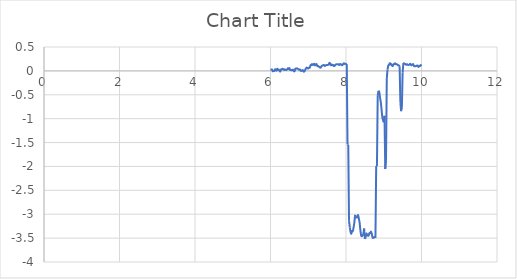
| Category | Series 0 |
|---|---|
| 6.0 | 0.021 |
| 6.02 | 0.028 |
| 6.04 | 0.028 |
| 6.06 | -0.007 |
| 6.08 | -0.001 |
| 6.1 | -0.001 |
| 6.12 | 0.032 |
| 6.14 | 0.028 |
| 6.16 | 0.005 |
| 6.18 | 0.044 |
| 6.2 | 0.021 |
| 6.22 | 0.028 |
| 6.24 | 0.001 |
| 6.26 | -0.013 |
| 6.28 | 0.031 |
| 6.3 | 0.031 |
| 6.32 | 0.044 |
| 6.34 | 0.036 |
| 6.36 | 0.018 |
| 6.38 | 0.032 |
| 6.4 | 0.021 |
| 6.42 | 0.021 |
| 6.44 | 0.03 |
| 6.46 | 0.055 |
| 6.48 | 0.038 |
| 6.5 | 0.059 |
| 6.52 | 0.02 |
| 6.54 | 0.02 |
| 6.56 | 0.011 |
| 6.58 | 0.02 |
| 6.6 | 0.024 |
| 6.62 | -0.008 |
| 6.64 | -0.004 |
| 6.66 | 0.045 |
| 6.68 | 0.045 |
| 6.7 | 0.053 |
| 6.72 | 0.045 |
| 6.74 | 0.035 |
| 6.76 | 0.025 |
| 6.78 | 0.028 |
| 6.8 | 0.004 |
| 6.82 | -0.001 |
| 6.84 | 0.014 |
| 6.86 | 0.014 |
| 6.88 | -0.015 |
| 6.9 | -0.008 |
| 6.92 | 0.023 |
| 6.94 | 0.053 |
| 6.96 | 0.069 |
| 6.98 | 0.06 |
| 7.0 | 0.049 |
| 7.02 | 0.066 |
| 7.04 | 0.066 |
| 7.06 | 0.12 |
| 7.08 | 0.12 |
| 7.1 | 0.143 |
| 7.12 | 0.124 |
| 7.14 | 0.13 |
| 7.16 | 0.149 |
| 7.18 | 0.115 |
| 7.2 | 0.136 |
| 7.22 | 0.141 |
| 7.24 | 0.102 |
| 7.26 | 0.102 |
| 7.28 | 0.089 |
| 7.3 | 0.079 |
| 7.32 | 0.065 |
| 7.34 | 0.08 |
| 7.36 | 0.107 |
| 7.38 | 0.111 |
| 7.4 | 0.121 |
| 7.42 | 0.121 |
| 7.44 | 0.102 |
| 7.46 | 0.114 |
| 7.48 | 0.123 |
| 7.5 | 0.125 |
| 7.52 | 0.125 |
| 7.54 | 0.132 |
| 7.56 | 0.167 |
| 7.58 | 0.154 |
| 7.6 | 0.117 |
| 7.62 | 0.135 |
| 7.64 | 0.119 |
| 7.66 | 0.123 |
| 7.68 | 0.101 |
| 7.7 | 0.107 |
| 7.72 | 0.129 |
| 7.74 | 0.135 |
| 7.76 | 0.139 |
| 7.78 | 0.139 |
| 7.8 | 0.135 |
| 7.82 | 0.123 |
| 7.84 | 0.142 |
| 7.86 | 0.142 |
| 7.88 | 0.123 |
| 7.9 | 0.12 |
| 7.92 | 0.137 |
| 7.94 | 0.161 |
| 7.96 | 0.147 |
| 7.98 | 0.147 |
| 8.0 | 0.147 |
| 8.02 | 0.144 |
| 8.04 | -1.536 |
| 8.06 | -1.55 |
| 8.08 | -3.137 |
| 8.1 | -3.273 |
| 8.12 | -3.368 |
| 8.14 | -3.41 |
| 8.16 | -3.35 |
| 8.18 | -3.356 |
| 8.2 | -3.278 |
| 8.22 | -3.184 |
| 8.24 | -3.014 |
| 8.26 | -3.059 |
| 8.28 | -3.071 |
| 8.3 | -3.054 |
| 8.32 | -3.018 |
| 8.34 | -3.091 |
| 8.36 | -3.175 |
| 8.38 | -3.325 |
| 8.4 | -3.442 |
| 8.42 | -3.461 |
| 8.44 | -3.443 |
| 8.46 | -3.409 |
| 8.48 | -3.299 |
| 8.5 | -3.515 |
| 8.52 | -3.488 |
| 8.54 | -3.405 |
| 8.56 | -3.429 |
| 8.58 | -3.45 |
| 8.6 | -3.448 |
| 8.62 | -3.395 |
| 8.64 | -3.395 |
| 8.66 | -3.363 |
| 8.68 | -3.401 |
| 8.7 | -3.479 |
| 8.72 | -3.498 |
| 8.74 | -3.482 |
| 8.76 | -3.48 |
| 8.78 | -3.497 |
| 8.8 | -1.992 |
| 8.82 | -1.992 |
| 8.84 | -0.522 |
| 8.86 | -0.416 |
| 8.88 | -0.439 |
| 8.9 | -0.554 |
| 8.92 | -0.645 |
| 8.94 | -0.794 |
| 8.96 | -0.958 |
| 8.98 | -1.027 |
| 9.0 | -1.077 |
| 9.02 | -0.94 |
| 9.04 | -2.053 |
| 9.06 | -1.88 |
| 9.08 | -0.167 |
| 9.1 | 0.03 |
| 9.12 | 0.111 |
| 9.14 | 0.122 |
| 9.16 | 0.161 |
| 9.18 | 0.136 |
| 9.2 | 0.141 |
| 9.22 | 0.11 |
| 9.24 | 0.103 |
| 9.26 | 0.138 |
| 9.28 | 0.143 |
| 9.3 | 0.16 |
| 9.32 | 0.139 |
| 9.34 | 0.139 |
| 9.36 | 0.133 |
| 9.38 | 0.117 |
| 9.4 | 0.115 |
| 9.42 | 0.097 |
| 9.44 | -0.654 |
| 9.46 | -0.843 |
| 9.48 | -0.77 |
| 9.5 | -0.032 |
| 9.52 | 0.163 |
| 9.54 | 0.163 |
| 9.56 | 0.148 |
| 9.58 | 0.136 |
| 9.6 | 0.127 |
| 9.62 | 0.142 |
| 9.64 | 0.126 |
| 9.66 | 0.126 |
| 9.68 | 0.13 |
| 9.7 | 0.149 |
| 9.72 | 0.123 |
| 9.74 | 0.12 |
| 9.76 | 0.137 |
| 9.78 | 0.14 |
| 9.8 | 0.101 |
| 9.82 | 0.097 |
| 9.84 | 0.099 |
| 9.86 | 0.102 |
| 9.88 | 0.11 |
| 9.9 | 0.11 |
| 9.92 | 0.082 |
| 9.94 | 0.101 |
| 9.96 | 0.101 |
| 9.98 | 0.122 |
| 10.0 | 0.101 |